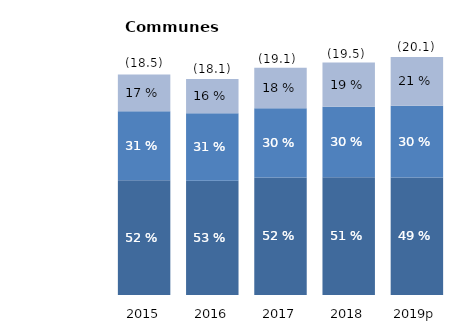
| Category | Personnel | Autre fonctionnement | Investissement |
|---|---|---|---|
| 2015 | 9.633 | 5.799 | 3.102 |
| 2016 | 9.604 | 5.671 | 2.868 |
| 2017 | 9.884 | 5.803 | 3.407 |
| 2018 | 9.886 | 5.924 | 3.738 |
| 2019p | 9.884 | 6.016 | 4.15 |